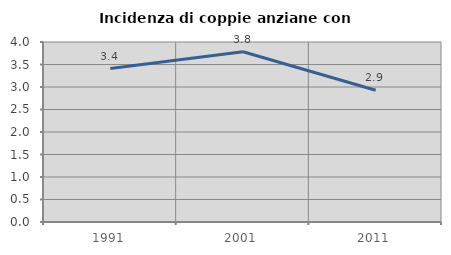
| Category | Incidenza di coppie anziane con figli |
|---|---|
| 1991.0 | 3.411 |
| 2001.0 | 3.783 |
| 2011.0 | 2.929 |